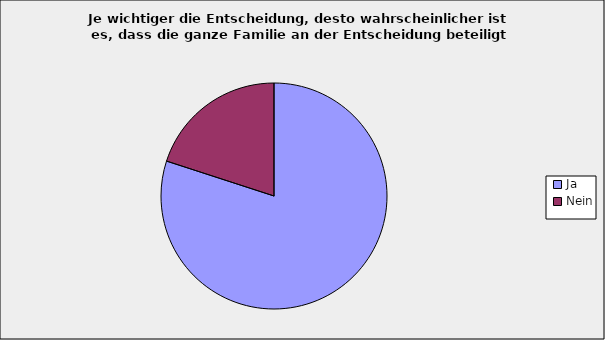
| Category | Series 0 |
|---|---|
| Ja | 0.8 |
| Nein | 0.2 |